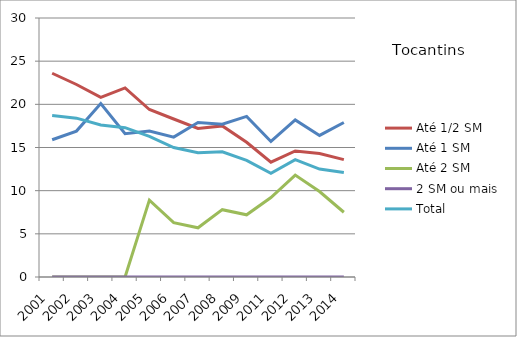
| Category | Até 1/2 SM | Até 1 SM | Até 2 SM | 2 SM ou mais | Total |
|---|---|---|---|---|---|
| 2001.0 | 23.6 | 15.9 | 0 | 0 | 18.7 |
| 2002.0 | 22.3 | 16.9 | 0 | 0 | 18.4 |
| 2003.0 | 20.8 | 20.1 | 0 | 0 | 17.6 |
| 2004.0 | 21.9 | 16.6 | 0 | 0 | 17.3 |
| 2005.0 | 19.4 | 16.9 | 8.9 | 0 | 16.3 |
| 2006.0 | 18.3 | 16.2 | 6.3 | 0 | 15 |
| 2007.0 | 17.2 | 17.9 | 5.7 | 0 | 14.4 |
| 2008.0 | 17.5 | 17.7 | 7.8 | 0 | 14.5 |
| 2009.0 | 15.6 | 18.6 | 7.2 | 0 | 13.5 |
| 2011.0 | 13.3 | 15.7 | 9.2 | 0 | 12 |
| 2012.0 | 14.6 | 18.2 | 11.8 | 0 | 13.6 |
| 2013.0 | 14.3 | 16.4 | 9.9 | 0 | 12.5 |
| 2014.0 | 13.6 | 17.9 | 7.5 | 0 | 12.1 |